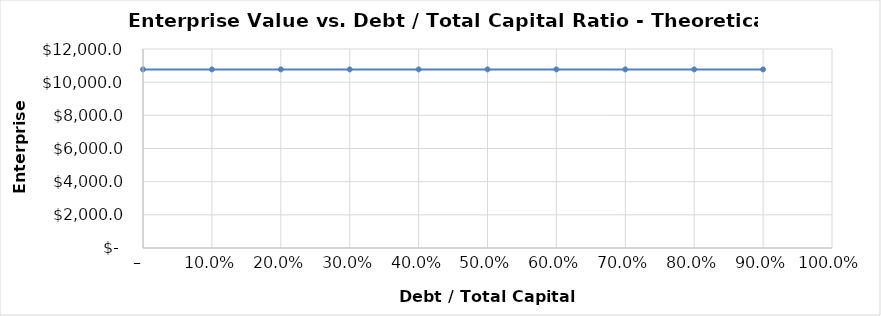
| Category | Series 0 |
|---|---|
| 0.0 | 10770.635 |
| 0.1 | 10770.635 |
| 0.2 | 10770.635 |
| 0.30000000000000004 | 10770.635 |
| 0.4 | 10770.635 |
| 0.5 | 10770.635 |
| 0.6 | 10770.635 |
| 0.7 | 10770.635 |
| 0.7999999999999999 | 10770.635 |
| 0.8999999999999999 | 10770.635 |